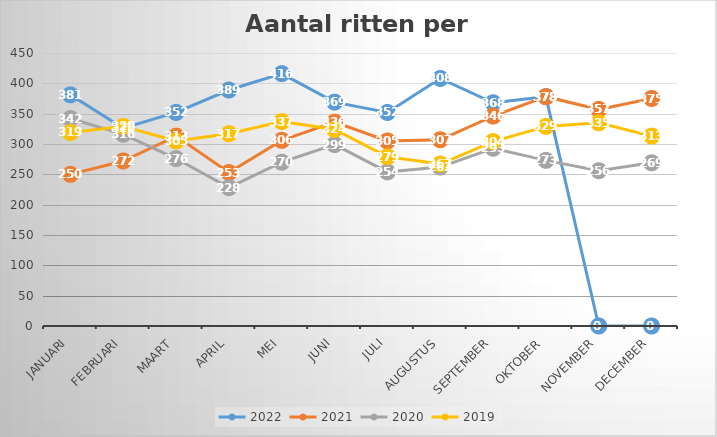
| Category | 2022 | 2021 | 2020 | 2019 |
|---|---|---|---|---|
| januari | 381 | 250 | 342 | 319 |
| februari | 326 | 272 | 316 | 329 |
| maart | 352 | 313 | 276 | 305 |
| april | 389 | 253 | 228 | 317 |
| mei | 416 | 306 | 270 | 337 |
| juni | 369 | 336 | 299 | 324 |
| juli | 352 | 305 | 254 | 279 |
| augustus | 408 | 307 | 262 | 267 |
| september | 368 | 346 | 293 | 304 |
| oktober | 378 | 378 | 273 | 329 |
| november | 0 | 357 | 256 | 335 |
| december | 0 | 375 | 269 | 313 |